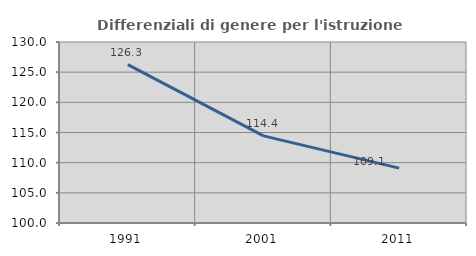
| Category | Differenziali di genere per l'istruzione superiore |
|---|---|
| 1991.0 | 126.257 |
| 2001.0 | 114.436 |
| 2011.0 | 109.092 |